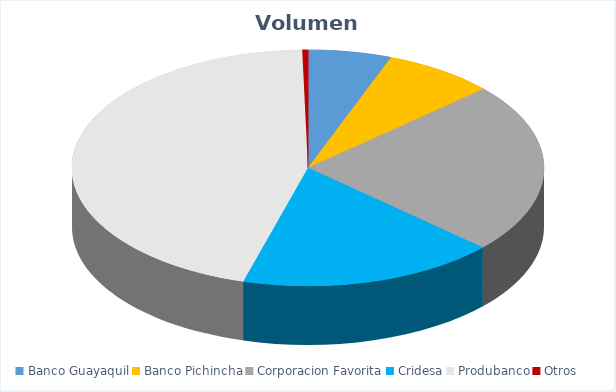
| Category | VOLUMEN ($USD) |
|---|---|
| Banco Guayaquil | 2904 |
| Banco Pichincha | 3895 |
| Corporacion Favorita | 11933.72 |
| Cridesa | 9000 |
| Produbanco | 23034.81 |
| Otros | 198 |